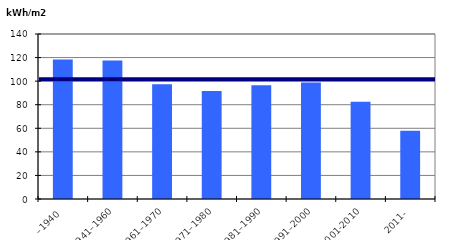
| Category | Byggårskategori |
|---|---|
| –1940 | 118.464 |
| 1941–1960 | 117.433 |
| 1961–1970 | 97.364 |
| 1971–1980 | 91.68 |
| 1981–1990 | 96.467 |
| 1991–2000 | 98.893 |
| 2001-2010 | 82.429 |
| 2011- | 57.881 |